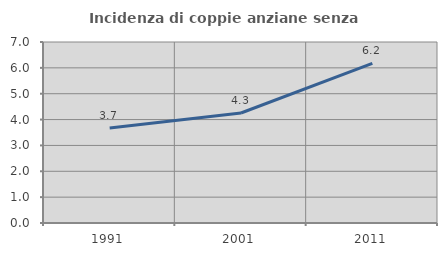
| Category | Incidenza di coppie anziane senza figli  |
|---|---|
| 1991.0 | 3.677 |
| 2001.0 | 4.253 |
| 2011.0 | 6.172 |